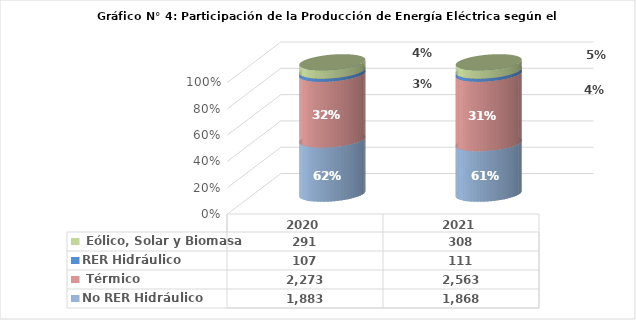
| Category | No RER | RER |
|---|---|---|
| 2020.0 | 2273.477 | 290.769 |
| 2021.0 | 2563.176 | 308.243 |